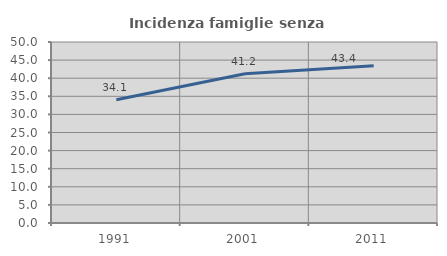
| Category | Incidenza famiglie senza nuclei |
|---|---|
| 1991.0 | 34.069 |
| 2001.0 | 41.223 |
| 2011.0 | 43.448 |